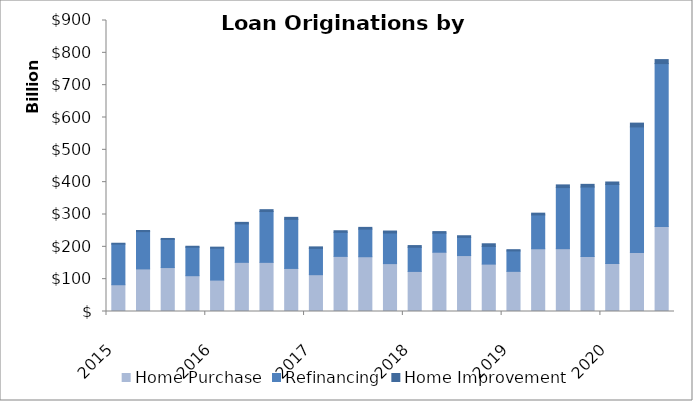
| Category | Home Purchase | Refinancing | Home Improvement |
|---|---|---|---|
| 2015 | 82786600013 | 125666195373 | 2663338111 |
| 2015 | 131719310021 | 115340051205 | 3404516283 |
| 2015 | 135918825644 | 87052696477 | 2919999705 |
| 2015 | 110737893992 | 88046918786 | 3008890589 |
| 2016 | 97161975641 | 98655367987 | 3206360454 |
| 2016 | 152048606800 | 118811037286 | 4855337842 |
| 2016 | 151988519149 | 157179533419 | 5769539506 |
| 2016 | 133187588388 | 151934080835 | 6064483118 |
| 2017 | 113829634250 | 81359069638 | 4651062407 |
| 2017 | 170444454197 | 74433630979 | 4887766339 |
| 2017 | 169392462027 | 85416781862 | 5370310177 |
| 2017 | 148104038533 | 94622483848 | 6168449784 |
| 2018 | 123918265027 | 74690371787 | 5301523310 |
| 2018 | 183305206616 | 59053391038 | 4783614107 |
| 2018 | 173035680065 | 56269972282 | 4971421243 |
| 2018 | 146578740960 | 54737606023 | 8156877156 |
| 2019 | 124126983620 | 63128364065 | 3950738662 |
| 2019 | 194069722857 | 104550724475 | 5521006103 |
| 2019 | 194309948575 | 188876219697 | 8389964388 |
| 2019 | 170204924717 | 214709875029 | 8344031083 |
| 2020 | 148566870850 | 244344931106 | 7625148712 |
| 2020 | 182637525645 | 388137680049 | 11854551949 |
| 2020 | 262952835031 | 503718108042 | 12443426010 |